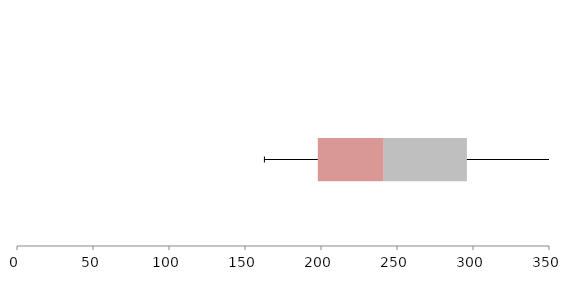
| Category | Series 1 | Series 2 | Series 3 |
|---|---|---|---|
| 0 | 197.9 | 43.368 | 54.71 |